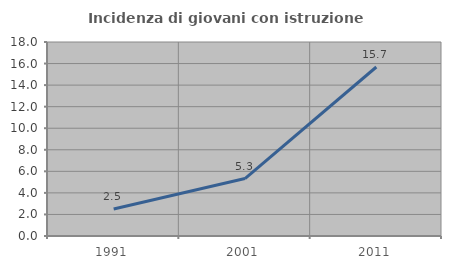
| Category | Incidenza di giovani con istruzione universitaria |
|---|---|
| 1991.0 | 2.51 |
| 2001.0 | 5.328 |
| 2011.0 | 15.68 |